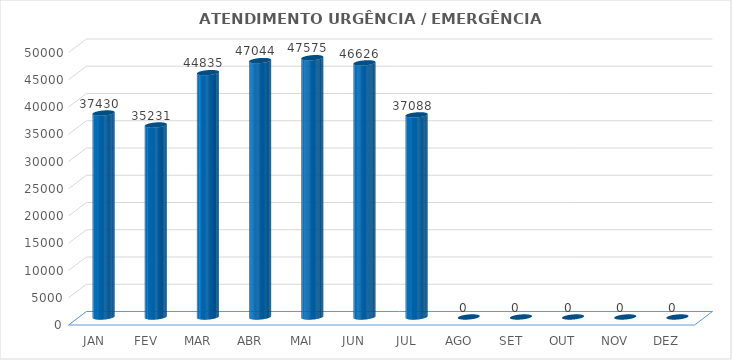
| Category | Series 0 |
|---|---|
| JAN | 37430 |
| FEV | 35231 |
| MAR | 44835 |
| ABR | 47044 |
| MAI | 47575 |
| JUN | 46626 |
| JUL | 37088 |
| AGO | 0 |
| SET | 0 |
| OUT | 0 |
| NOV | 0 |
| DEZ | 0 |